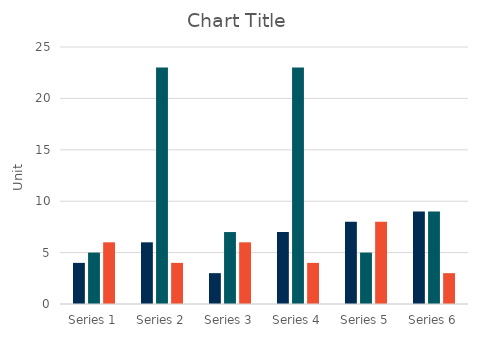
| Category | Series 0 | Series 1 | Series 2 |
|---|---|---|---|
| Series 1 | 4 | 5 | 6 |
| Series 2 | 6 | 23 | 4 |
| Series 3 | 3 | 7 | 6 |
| Series 4 | 7 | 23 | 4 |
| Series 5 | 8 | 5 | 8 |
| Series 6 | 9 | 9 | 3 |